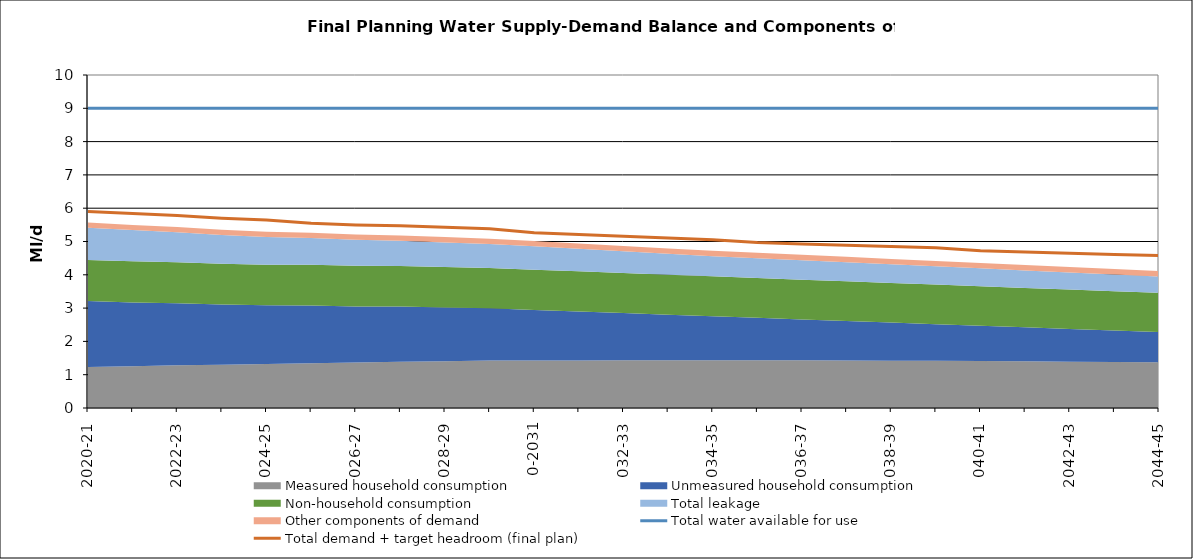
| Category | Total water available for use | Total demand + target headroom (final plan) |
|---|---|---|
| 0 | 9 | 5.903 |
| 1 | 9 | 5.838 |
| 2 | 9 | 5.777 |
| 3 | 9 | 5.702 |
| 4 | 9 | 5.649 |
| 5 | 9 | 5.546 |
| 6 | 9 | 5.498 |
| 7 | 9 | 5.473 |
| 8 | 9 | 5.427 |
| 9 | 9 | 5.381 |
| 10 | 9 | 5.266 |
| 11 | 9 | 5.209 |
| 12 | 9 | 5.158 |
| 13 | 9 | 5.103 |
| 14 | 9 | 5.055 |
| 15 | 9 | 4.967 |
| 16 | 9 | 4.928 |
| 17 | 9 | 4.89 |
| 18 | 9 | 4.849 |
| 19 | 9 | 4.811 |
| 20 | 9 | 4.726 |
| 21 | 9 | 4.687 |
| 22 | 9 | 4.65 |
| 23 | 9 | 4.608 |
| 24 | 9 | 4.576 |